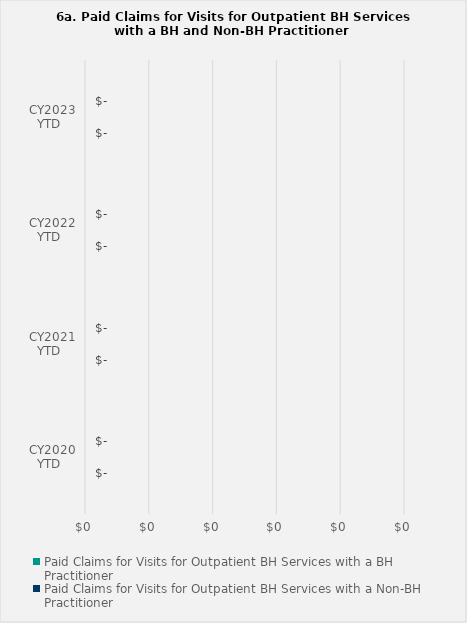
| Category | Paid Claims for Visits for Outpatient BH Services with a BH Practitioner | Paid Claims for Visits for Outpatient BH Services with a Non-BH Practitioner |
|---|---|---|
| CY2020 YTD | 0 | 0 |
| CY2021 YTD | 0 | 0 |
| CY2022 YTD | 0 | 0 |
| CY2023 YTD | 0 | 0 |